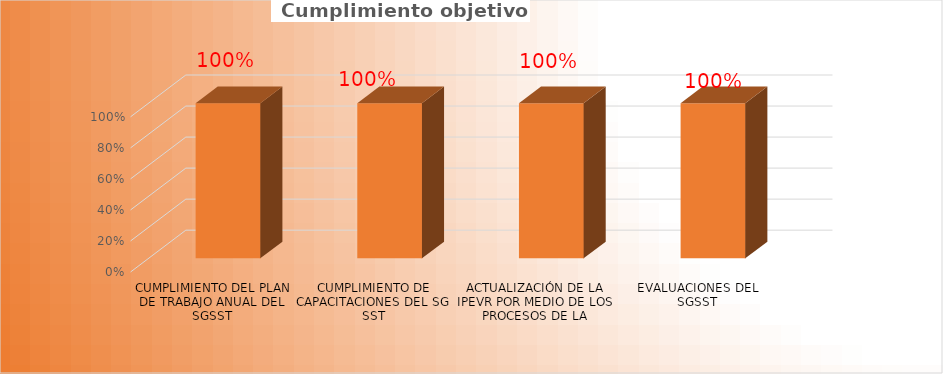
| Category | Series 0 |
|---|---|
| CUMPLIMIENTO DEL PLAN DE TRABAJO ANUAL DEL SGSST | 1 |
| CUMPLIMIENTO DE CAPACITACIONES DEL SG SST | 1 |
| ACTUALIZACIÓN DE LA IPEVR POR MEDIO DE LOS PROCESOS DE LA ENTIDAD | 1 |
| EVALUACIONES DEL SGSST | 1 |